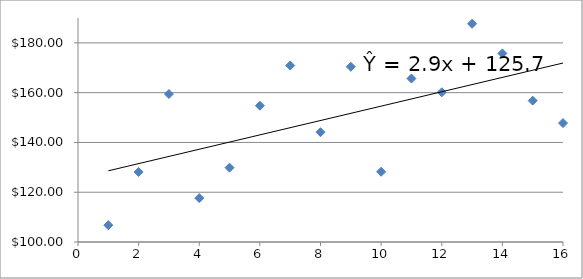
| Category | Series 0 |
|---|---|
| 1.0 | 106.75 |
| 2.0 | 128.12 |
| 3.0 | 159.45 |
| 4.0 | 117.65 |
| 5.0 | 129.87 |
| 6.0 | 154.76 |
| 7.0 | 170.91 |
| 8.0 | 144.12 |
| 9.0 | 170.4 |
| 10.0 | 128.21 |
| 11.0 | 165.67 |
| 12.0 | 160.16 |
| 13.0 | 187.68 |
| 14.0 | 175.78 |
| 15.0 | 156.79 |
| 16.0 | 147.8 |